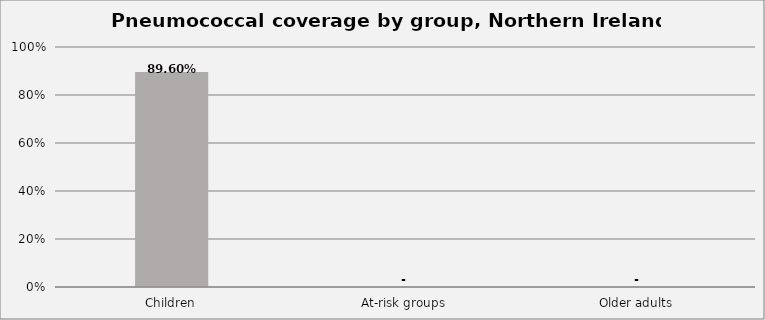
| Category | Series 0 |
|---|---|
| Children | 0.896 |
| At-risk groups | 0 |
| Older adults | 0 |